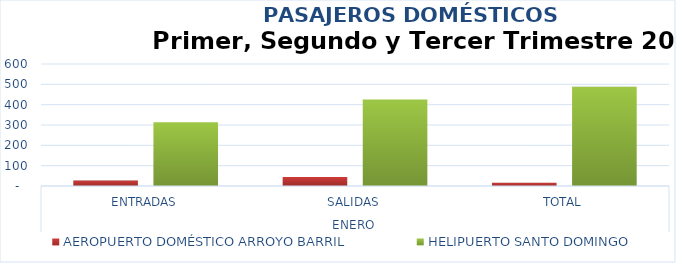
| Category | AEROPUERTO DOMÉSTICO ARROYO BARRIL | HELIPUERTO SANTO DOMINGO |
|---|---|---|
| 0 | 27 | 314 |
| 1 | 44 | 426 |
| 2 | 16 | 488 |